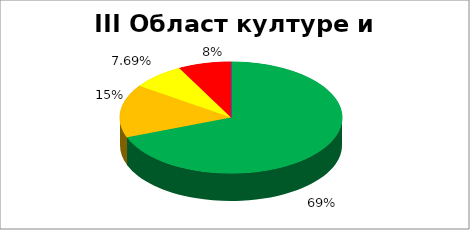
| Category | III Област културе и мeдија |
|---|---|
| 0 | 0.692 |
| 1 | 0.154 |
| 2 | 0.077 |
| 3 | 0.077 |
| 4 | 0 |